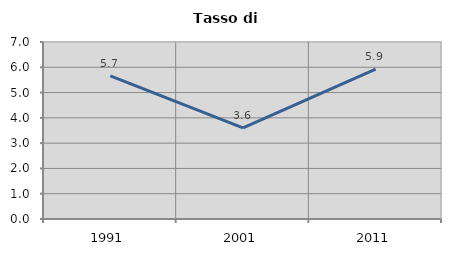
| Category | Tasso di disoccupazione   |
|---|---|
| 1991.0 | 5.66 |
| 2001.0 | 3.6 |
| 2011.0 | 5.923 |